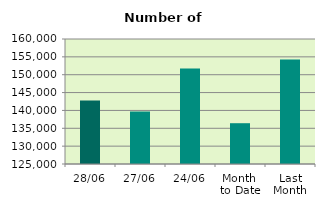
| Category | Series 0 |
|---|---|
| 28/06 | 142802 |
| 27/06 | 139700 |
| 24/06 | 151770 |
| Month 
to Date | 136422.6 |
| Last
Month | 154240.182 |